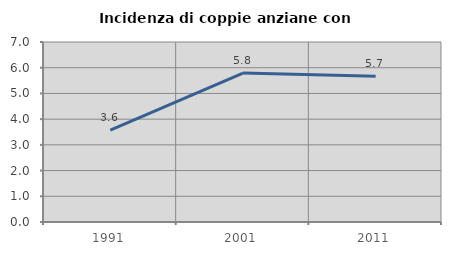
| Category | Incidenza di coppie anziane con figli |
|---|---|
| 1991.0 | 3.571 |
| 2001.0 | 5.793 |
| 2011.0 | 5.667 |